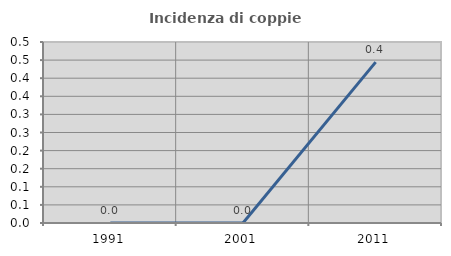
| Category | Incidenza di coppie miste |
|---|---|
| 1991.0 | 0 |
| 2001.0 | 0 |
| 2011.0 | 0.444 |